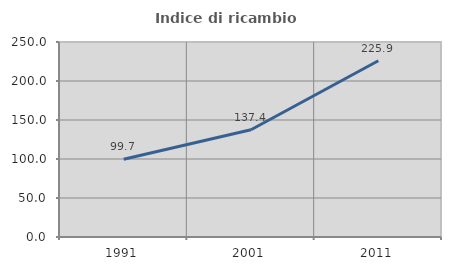
| Category | Indice di ricambio occupazionale  |
|---|---|
| 1991.0 | 99.734 |
| 2001.0 | 137.449 |
| 2011.0 | 225.922 |